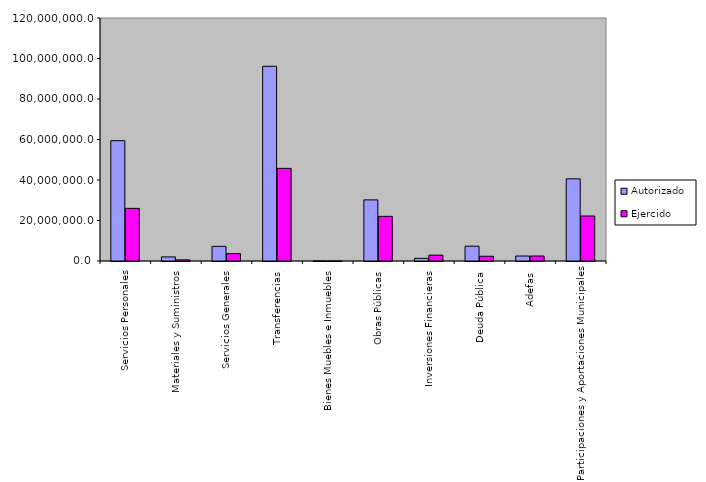
| Category | Autorizado | Ejercido |
|---|---|---|
| Servicios Personales | 59412369.7 | 25984356 |
| Materiales y Suministros | 2010410.8 | 559174 |
| Servicios Generales | 7238499.5 | 3634642.8 |
| Transferencias | 96147175.5 | 45740584.2 |
| Bienes Muebles e Inmuebles | 4024.6 | 1578.9 |
| Obras Públicas | 30180982.6 | 22050882.5 |
| Inversiones Financieras | 1325299.5 | 2889223.9 |
| Deuda Pública | 7312000 | 2352776.5 |
| Adefas | 2460661.3 | 2460530 |
| Participaciones y Aportaciones Municipales | 40558540.8 | 22210121.4 |